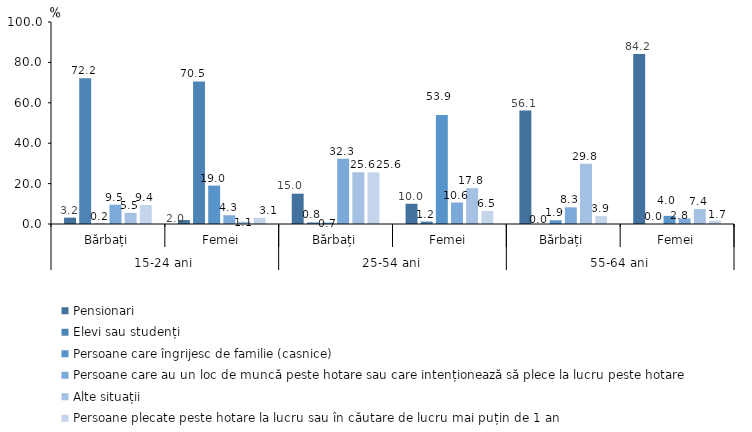
| Category | Pensionari | Elevi sau studenți | Persoane care îngrijesc de familie (casnice) | Persoane care au un loc de muncă peste hotare sau care intenționează să plece la lucru peste hotare | Alte situații | Persoane plecate peste hotare la lucru sau în căutare de lucru mai puțin de 1 an |
|---|---|---|---|---|---|---|
| 0 | 3.154 | 72.155 | 0.188 | 9.542 | 5.545 | 9.416 |
| 1 | 1.96 | 70.532 | 19.002 | 4.326 | 1.112 | 3.069 |
| 2 | 15.006 | 0.776 | 0.67 | 32.348 | 25.611 | 25.588 |
| 3 | 10.013 | 1.204 | 53.93 | 10.637 | 17.757 | 6.46 |
| 4 | 56.144 | 0 | 1.856 | 8.262 | 29.83 | 3.907 |
| 5 | 84.169 | 0 | 4.026 | 2.76 | 7.387 | 1.657 |